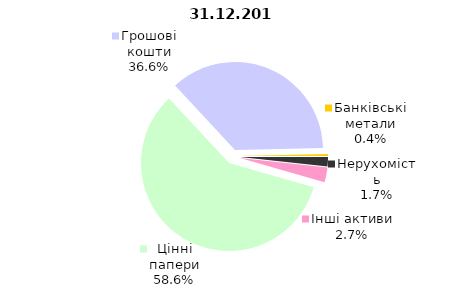
| Category | 31.12.2018 |
|---|---|
| Цінні папери | 1609.6 |
| Грошові кошти | 1004 |
| Банківські метали | 9.8 |
| Нерухомість | 47.3 |
| Інші активи | 74.5 |